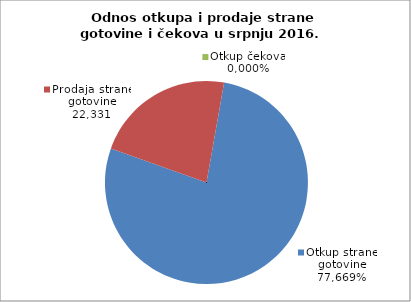
| Category | Otkup strane gotovine |
|---|---|
| 0 | 0.777 |
| 1 | 0.223 |
| 2 | 0 |